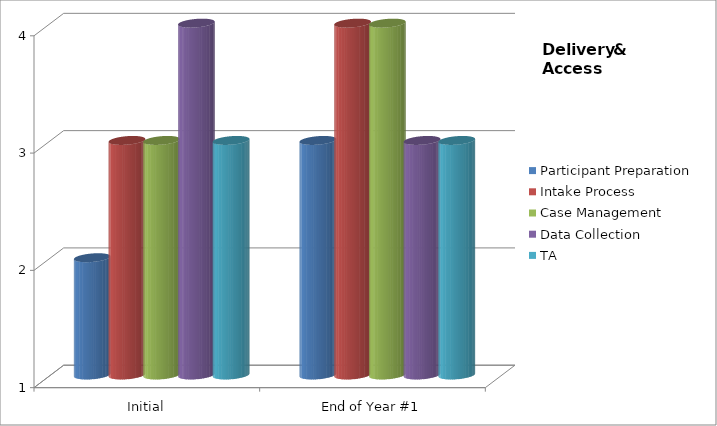
| Category | Participant Preparation  | Intake Process  | Case Management  | Data Collection  | TA |
|---|---|---|---|---|---|
| Initial | 2 | 3 | 3 | 4 | 3 |
| End of Year #1 | 3 | 4 | 4 | 3 | 3 |